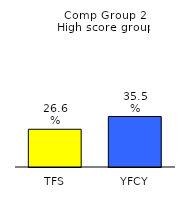
| Category | Series 0 |
|---|---|
| TFS | 0.266 |
| YFCY | 0.355 |